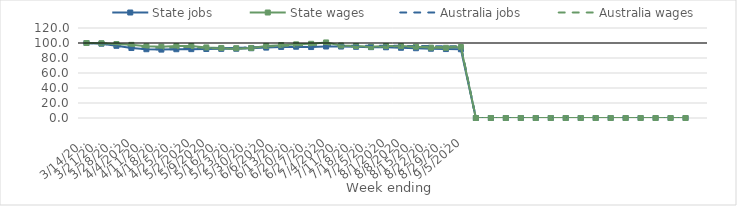
| Category | State jobs | State wages | Australia jobs | Australia wages |
|---|---|---|---|---|
| 14/03/2020 | 100 | 100 | 100 | 100 |
| 21/03/2020 | 99.072 | 99.675 | 99.287 | 99.672 |
| 28/03/2020 | 96.253 | 98.63 | 96.324 | 98.416 |
| 04/04/2020 | 93.295 | 97.515 | 93.668 | 96.718 |
| 11/04/2020 | 91.691 | 95.55 | 91.934 | 94.131 |
| 18/04/2020 | 91.189 | 95.053 | 91.469 | 94.023 |
| 25/04/2020 | 91.702 | 95.852 | 91.796 | 94.249 |
| 02/05/2020 | 91.826 | 96.052 | 92.192 | 94.719 |
| 09/05/2020 | 92.014 | 94.102 | 92.74 | 93.349 |
| 16/05/2020 | 92.205 | 93.356 | 93.27 | 92.686 |
| 23/05/2020 | 92.354 | 93.036 | 93.57 | 92.302 |
| 30/05/2020 | 93.012 | 93.362 | 94.082 | 93.6 |
| 06/06/2020 | 93.871 | 96.111 | 94.995 | 95.373 |
| 13/06/2020 | 94.751 | 97.15 | 95.458 | 96.064 |
| 20/06/2020 | 95.038 | 98.205 | 95.654 | 96.971 |
| 27/06/2020 | 94.615 | 98.957 | 95.59 | 97.092 |
| 04/07/2020 | 95.313 | 100.741 | 96.269 | 98.79 |
| 11/07/2020 | 95.28 | 96.63 | 96.518 | 95.694 |
| 18/07/2020 | 94.944 | 95.979 | 96.375 | 95.102 |
| 25/07/2020 | 94.477 | 94.88 | 96.44 | 94.758 |
| 01/08/2020 | 94.305 | 95.987 | 96.466 | 95.35 |
| 08/08/2020 | 93.635 | 95.834 | 96.196 | 95.604 |
| 15/08/2020 | 93.04 | 95.043 | 96.048 | 95.29 |
| 22/08/2020 | 92.355 | 93.786 | 95.872 | 94.881 |
| 29/08/2020 | 91.918 | 93.555 | 95.598 | 94.692 |
| 05/09/2020 | 91.65 | 94.629 | 95.533 | 95.73 |